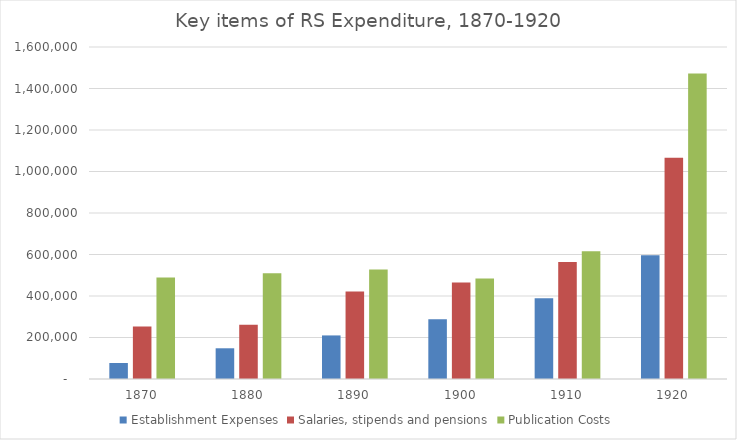
| Category | Establishment Expenses | Salaries, stipends and pensions | Publication Costs |
|---|---|---|---|
| 1870.0 | 77204 | 252952 | 488814 |
| 1880.0 | 148023 | 261501 | 509215 |
| 1890.0 | 209996 | 421344 | 527234 |
| 1900.0 | 288289 | 464901 | 483972 |
| 1910.0 | 388778 | 564366 | 615168 |
| 1920.0 | 596735 | 1065815 | 1472169 |